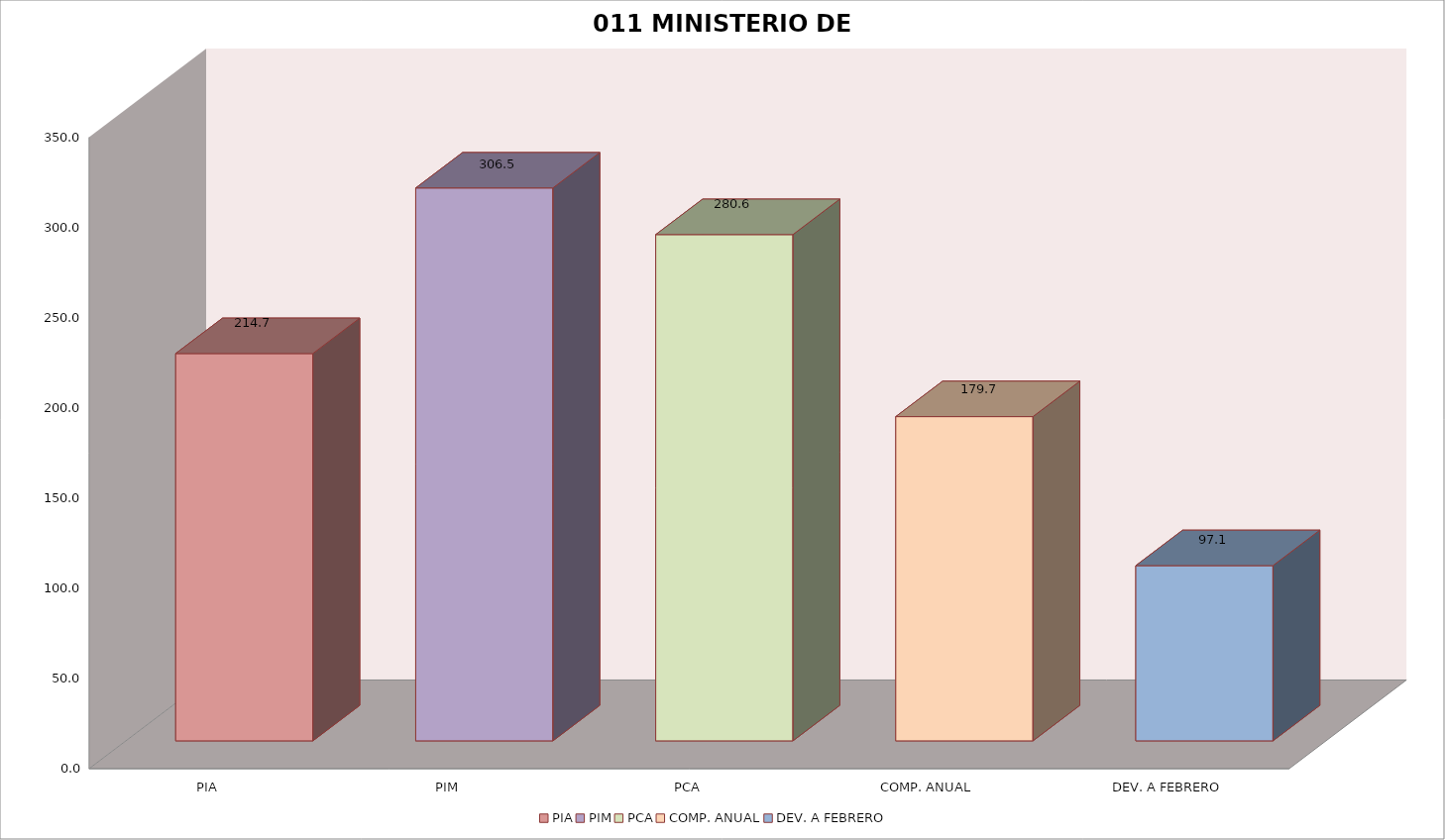
| Category | 011 MINISTERIO DE SALUD |
|---|---|
| PIA | 214.675 |
| PIM | 306.451 |
| PCA | 280.619 |
| COMP. ANUAL | 179.719 |
| DEV. A FEBRERO | 97.124 |